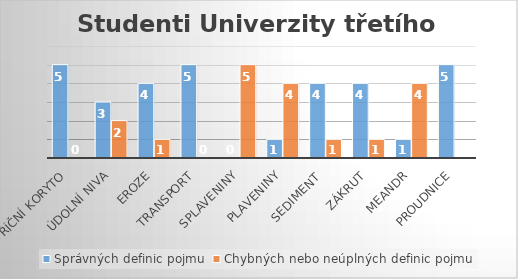
| Category | Správných definic pojmu | Chybných nebo neúplných definic pojmu |
|---|---|---|
| Říční koryto | 5 | 0 |
| Údolní niva | 3 | 2 |
| Eroze | 4 | 1 |
| Transport | 5 | 0 |
| Splaveniny | 0 | 5 |
| Plaveniny | 1 | 4 |
| Sediment  | 4 | 1 |
| Zákrut | 4 | 1 |
| Meandr | 1 | 4 |
| Proudnice | 5 | 0 |